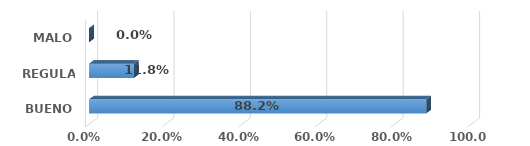
| Category | Series 0 |
|---|---|
| BUENO | 0.882 |
| REGULAR | 0.118 |
| MALO | 0 |